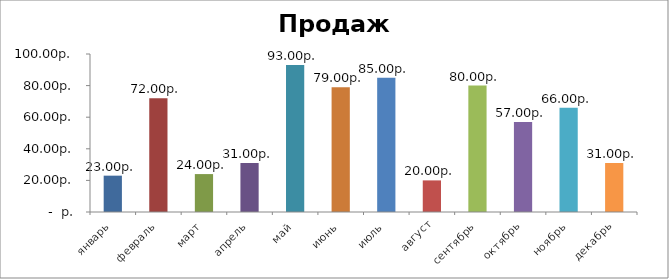
| Category | Продажи |
|---|---|
| январь | 23 |
| февраль | 72 |
| март | 24 |
| апрель | 31 |
| май | 93 |
| июнь | 79 |
| июль | 85 |
| август | 20 |
| сентябрь | 80 |
| октябрь | 57 |
| ноябрь | 66 |
| декабрь | 31 |